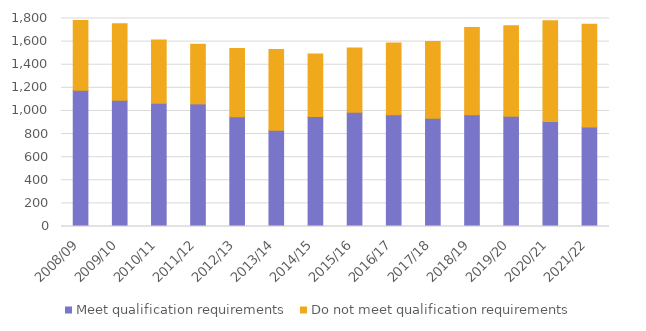
| Category | Meet qualification requirements | Do not meet qualification requirements |
|---|---|---|
| 2008/09 | 1179 | 604 |
| 2009/10 | 1093 | 661 |
| 2010/11 | 1066 | 549 |
| 2011/12 | 1061 | 516 |
| 2012/13 | 950 | 590 |
| 2013/14 | 832 | 700 |
| 2014/15 | 952 | 540 |
| 2015/16 | 988 | 556 |
| 2016/17 | 967 | 622 |
| 2017/18 | 937 | 663 |
| 2018/19 | 968 | 755 |
| 2019/20 | 954 | 784 |
| 2020/21 | 909 | 871 |
| 2021/22 | 860 | 891 |